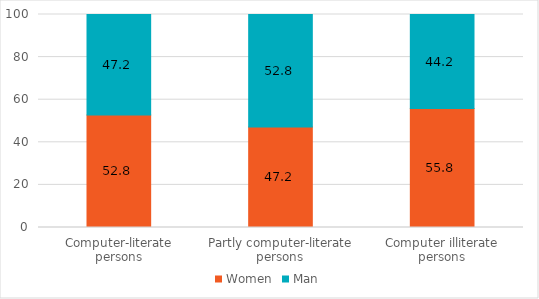
| Category | Women | Man |
|---|---|---|
| Computer-literate
persons | 52.817 | 47.183 |
| Partly computer-literate persons | 47.208 | 52.792 |
| Computer illiterate
persons | 55.816 | 44.184 |